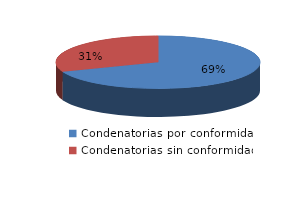
| Category | Series 0 |
|---|---|
| 0 | 65 |
| 1 | 29 |